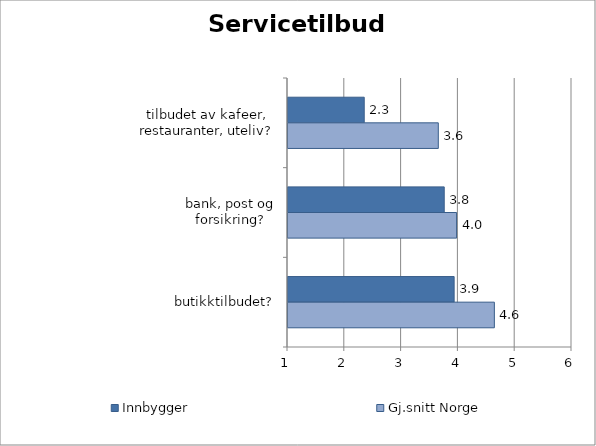
| Category | Innbygger | Gj.snitt Norge |
|---|---|---|
| tilbudet av kafeer, restauranter, uteliv? | 2.342 | 3.646 |
| bank, post og forsikring? | 3.751 | 3.968 |
| butikktilbudet? | 3.925 | 4.633 |